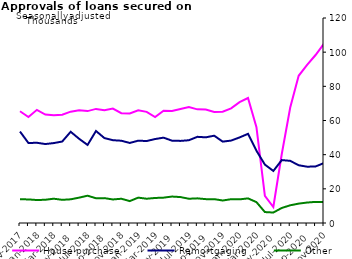
| Category | House purchase | Remortgaging | Other |
|---|---|---|---|
| Nov-2017 | 65396 | 53535 | 13880 |
| Dec-2017 | 62004 | 46819 | 13807 |
| Jan-2018 | 66238 | 46968 | 13444 |
| Feb-2018 | 63465 | 46215 | 13604 |
| Mar-2018 | 63096 | 46786 | 14219 |
| Apr-2018 | 63378 | 47690 | 13571 |
| May-2018 | 65168 | 53410 | 13863 |
| Jun-2018 | 65977 | 49295 | 14840 |
| Jul-2018 | 65496 | 45693 | 15987 |
| Aug-2018 | 66792 | 53861 | 14485 |
| Sep-2018 | 65963 | 49699 | 14561 |
| Oct-2018 | 67006 | 48472 | 13777 |
| Nov-2018 | 64264 | 48158 | 14203 |
| Dec-2018 | 64148 | 46857 | 12823 |
| Jan-2019 | 66015 | 48188 | 14852 |
| Feb-2019 | 65061 | 47984 | 14208 |
| Mar-2019 | 61987 | 49150 | 14651 |
| Apr-2019 | 65704 | 49958 | 14842 |
| May-2019 | 65587 | 48186 | 15480 |
| Jun-2019 | 66742 | 48060 | 15182 |
| Jul-2019 | 67934 | 48445 | 14197 |
| Aug-2019 | 66520 | 50442 | 14431 |
| Sep-2019 | 66372 | 50150 | 13969 |
| Oct-2019 | 64960 | 51102 | 13965 |
| Nov-2019 | 65119 | 47643 | 13172 |
| Dec-2019 | 67112 | 48240 | 13932 |
| Jan-2020 | 70774 | 50086 | 13829 |
| Feb-2020 | 73149 | 52210 | 14413 |
| Mar-2020 | 56074 | 42310 | 12222 |
| Apr-2020 | 15886 | 34178 | 6406 |
| May-2020 | 9348 | 30466 | 6125 |
| Jun-2020 | 40384 | 36821 | 8802 |
| Jul-2020 | 67561 | 36380 | 10368 |
| Aug-2020 | 86174 | 33803 | 11352 |
| Sep-2020 | 92594 | 32958 | 11976 |
| Oct-2020 | 98338 | 33089 | 12365 |
| Nov-2020 | 104969 | 35107 | 12283 |